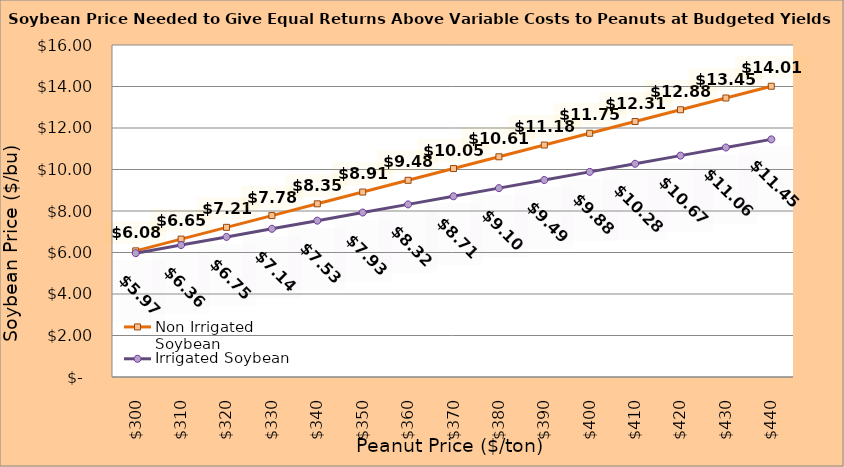
| Category | Non Irrigated Soybean | Irrigated Soybean |
|---|---|---|
| 299.8936170212766 | 6.079 | 5.968 |
| 309.8936170212766 | 6.646 | 6.36 |
| 319.8936170212766 | 7.213 | 6.752 |
| 329.8936170212766 | 7.779 | 7.143 |
| 339.8936170212766 | 8.346 | 7.535 |
| 349.8936170212766 | 8.913 | 7.927 |
| 359.8936170212766 | 9.479 | 8.318 |
| 369.8936170212766 | 10.046 | 8.71 |
| 379.8936170212766 | 10.613 | 9.102 |
| 389.8936170212766 | 11.179 | 9.493 |
| 399.8936170212766 | 11.746 | 9.885 |
| 409.8936170212766 | 12.313 | 10.277 |
| 419.8936170212766 | 12.879 | 10.668 |
| 429.8936170212766 | 13.446 | 11.06 |
| 439.8936170212766 | 14.013 | 11.452 |